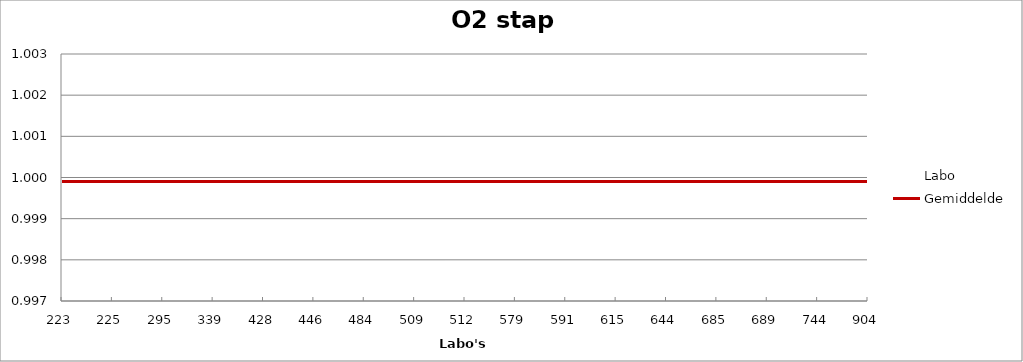
| Category | Labo | Gemiddelde |
|---|---|---|
| 223.0 | 1.001 | 1 |
| 225.0 | 1 | 1 |
| 295.0 | 1 | 1 |
| 339.0 | 1.002 | 1 |
| 428.0 | 0.999 | 1 |
| 446.0 | 0.999 | 1 |
| 484.0 | 1.001 | 1 |
| 509.0 | 1 | 1 |
| 512.0 | 0.999 | 1 |
| 579.0 | 1 | 1 |
| 591.0 | 0.999 | 1 |
| 615.0 | 0.999 | 1 |
| 644.0 | 1 | 1 |
| 685.0 | 1 | 1 |
| 689.0 | 1 | 1 |
| 744.0 | 1 | 1 |
| 904.0 | 1 | 1 |